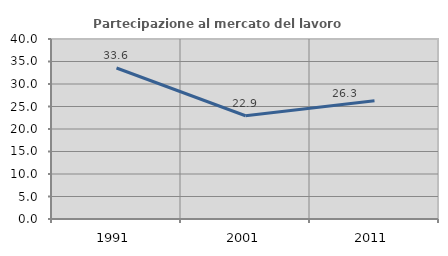
| Category | Partecipazione al mercato del lavoro  femminile |
|---|---|
| 1991.0 | 33.559 |
| 2001.0 | 22.945 |
| 2011.0 | 26.29 |